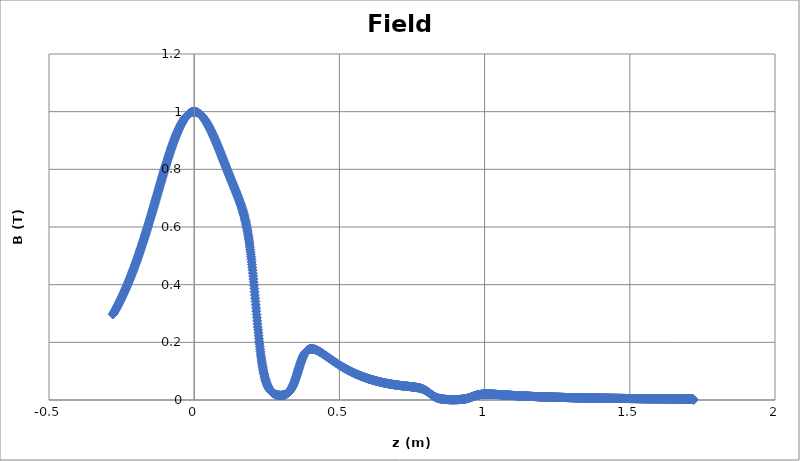
| Category | Series 0 |
|---|---|
| -0.28 | 0.297 |
| -0.279 | 0.298 |
| -0.278 | 0.3 |
| -0.277 | 0.302 |
| -0.276 | 0.304 |
| -0.275 | 0.306 |
| -0.274 | 0.307 |
| -0.273 | 0.309 |
| -0.272 | 0.311 |
| -0.271 | 0.313 |
| -0.27 | 0.315 |
| -0.269 | 0.317 |
| -0.268 | 0.319 |
| -0.267 | 0.32 |
| -0.266 | 0.322 |
| -0.265 | 0.324 |
| -0.264 | 0.326 |
| -0.263 | 0.328 |
| -0.262 | 0.33 |
| -0.261 | 0.332 |
| -0.26 | 0.334 |
| -0.259 | 0.336 |
| -0.258 | 0.338 |
| -0.257 | 0.34 |
| -0.256 | 0.342 |
| -0.255 | 0.344 |
| -0.254 | 0.346 |
| -0.253 | 0.348 |
| -0.252 | 0.351 |
| -0.251 | 0.353 |
| -0.25 | 0.355 |
| -0.249 | 0.357 |
| -0.248 | 0.359 |
| -0.247 | 0.361 |
| -0.246 | 0.363 |
| -0.245 | 0.366 |
| -0.244 | 0.368 |
| -0.243 | 0.37 |
| -0.242 | 0.372 |
| -0.241 | 0.374 |
| -0.24 | 0.377 |
| -0.239 | 0.379 |
| -0.238 | 0.381 |
| -0.237 | 0.383 |
| -0.236 | 0.386 |
| -0.235 | 0.388 |
| -0.234 | 0.39 |
| -0.233 | 0.393 |
| -0.232 | 0.395 |
| -0.231 | 0.397 |
| -0.23 | 0.4 |
| -0.229 | 0.402 |
| -0.228 | 0.405 |
| -0.227 | 0.407 |
| -0.226 | 0.41 |
| -0.225 | 0.412 |
| -0.224 | 0.414 |
| -0.223 | 0.417 |
| -0.222 | 0.419 |
| -0.221 | 0.422 |
| -0.22 | 0.424 |
| -0.219 | 0.427 |
| -0.218 | 0.43 |
| -0.217 | 0.432 |
| -0.216 | 0.435 |
| -0.215 | 0.437 |
| -0.214 | 0.44 |
| -0.213 | 0.443 |
| -0.212 | 0.445 |
| -0.211 | 0.448 |
| -0.21 | 0.45 |
| -0.209 | 0.453 |
| -0.208 | 0.456 |
| -0.207 | 0.459 |
| -0.206 | 0.461 |
| -0.205 | 0.464 |
| -0.204 | 0.467 |
| -0.203 | 0.47 |
| -0.202 | 0.472 |
| -0.201 | 0.475 |
| -0.2 | 0.478 |
| -0.199 | 0.481 |
| -0.198 | 0.484 |
| -0.197 | 0.486 |
| -0.196 | 0.489 |
| -0.195 | 0.492 |
| -0.194 | 0.495 |
| -0.193 | 0.498 |
| -0.192 | 0.501 |
| -0.191 | 0.504 |
| -0.19 | 0.507 |
| -0.189 | 0.51 |
| -0.188 | 0.513 |
| -0.187 | 0.516 |
| -0.186 | 0.519 |
| -0.185 | 0.522 |
| -0.184 | 0.525 |
| -0.183 | 0.528 |
| -0.182 | 0.531 |
| -0.181 | 0.534 |
| -0.18 | 0.537 |
| -0.179 | 0.54 |
| -0.178 | 0.543 |
| -0.177 | 0.546 |
| -0.176 | 0.549 |
| -0.175 | 0.552 |
| -0.174 | 0.556 |
| -0.173 | 0.559 |
| -0.172 | 0.562 |
| -0.171 | 0.565 |
| -0.17 | 0.568 |
| -0.169 | 0.571 |
| -0.168 | 0.575 |
| -0.167 | 0.578 |
| -0.166 | 0.581 |
| -0.165 | 0.584 |
| -0.164 | 0.588 |
| -0.163 | 0.591 |
| -0.162 | 0.594 |
| -0.161 | 0.597 |
| -0.16 | 0.601 |
| -0.159 | 0.604 |
| -0.158 | 0.607 |
| -0.157 | 0.611 |
| -0.156 | 0.614 |
| -0.155 | 0.617 |
| -0.154 | 0.621 |
| -0.153 | 0.624 |
| -0.152 | 0.627 |
| -0.151 | 0.631 |
| -0.15 | 0.634 |
| -0.149 | 0.638 |
| -0.148 | 0.641 |
| -0.147 | 0.644 |
| -0.146 | 0.648 |
| -0.145 | 0.651 |
| -0.144 | 0.655 |
| -0.143 | 0.658 |
| -0.142 | 0.662 |
| -0.141 | 0.665 |
| -0.14 | 0.668 |
| -0.139 | 0.672 |
| -0.138 | 0.675 |
| -0.137 | 0.679 |
| -0.136 | 0.682 |
| -0.135 | 0.686 |
| -0.134 | 0.689 |
| -0.133 | 0.693 |
| -0.132 | 0.696 |
| -0.131 | 0.7 |
| -0.13 | 0.703 |
| -0.129 | 0.707 |
| -0.128 | 0.71 |
| -0.127 | 0.714 |
| -0.126 | 0.717 |
| -0.125 | 0.721 |
| -0.124 | 0.724 |
| -0.123 | 0.727 |
| -0.122 | 0.731 |
| -0.121 | 0.734 |
| -0.12 | 0.738 |
| -0.119 | 0.741 |
| -0.118 | 0.745 |
| -0.117 | 0.748 |
| -0.116 | 0.752 |
| -0.115 | 0.755 |
| -0.114 | 0.759 |
| -0.113 | 0.762 |
| -0.112 | 0.766 |
| -0.111 | 0.769 |
| -0.11 | 0.772 |
| -0.109 | 0.776 |
| -0.108 | 0.779 |
| -0.107 | 0.783 |
| -0.106 | 0.786 |
| -0.105 | 0.789 |
| -0.104 | 0.793 |
| -0.103 | 0.796 |
| -0.102 | 0.799 |
| -0.101 | 0.803 |
| -0.1 | 0.806 |
| -0.099 | 0.809 |
| -0.098 | 0.813 |
| -0.097 | 0.816 |
| -0.096 | 0.819 |
| -0.095 | 0.823 |
| -0.094 | 0.826 |
| -0.093 | 0.829 |
| -0.092 | 0.832 |
| -0.091 | 0.835 |
| -0.09 | 0.839 |
| -0.089 | 0.842 |
| -0.088 | 0.845 |
| -0.087 | 0.848 |
| -0.086 | 0.851 |
| -0.085 | 0.854 |
| -0.084 | 0.857 |
| -0.083 | 0.86 |
| -0.082 | 0.863 |
| -0.081 | 0.866 |
| -0.08 | 0.869 |
| -0.079 | 0.872 |
| -0.078 | 0.875 |
| -0.077 | 0.878 |
| -0.076 | 0.881 |
| -0.075 | 0.884 |
| -0.074 | 0.887 |
| -0.073 | 0.89 |
| -0.072 | 0.892 |
| -0.071 | 0.895 |
| -0.07 | 0.898 |
| -0.069 | 0.901 |
| -0.068 | 0.903 |
| -0.067 | 0.906 |
| -0.066 | 0.909 |
| -0.065 | 0.911 |
| -0.064 | 0.914 |
| -0.063 | 0.916 |
| -0.062 | 0.919 |
| -0.061 | 0.921 |
| -0.06 | 0.924 |
| -0.059 | 0.926 |
| -0.058 | 0.929 |
| -0.057 | 0.931 |
| -0.056 | 0.933 |
| -0.055 | 0.936 |
| -0.054 | 0.938 |
| -0.053 | 0.94 |
| -0.052 | 0.942 |
| -0.051 | 0.944 |
| -0.05 | 0.946 |
| -0.049 | 0.948 |
| -0.048 | 0.951 |
| -0.047 | 0.952 |
| -0.046 | 0.954 |
| -0.045 | 0.956 |
| -0.044 | 0.958 |
| -0.043 | 0.96 |
| -0.042 | 0.962 |
| -0.041 | 0.964 |
| -0.04 | 0.965 |
| -0.039 | 0.967 |
| -0.038 | 0.969 |
| -0.037 | 0.97 |
| -0.036 | 0.972 |
| -0.035 | 0.973 |
| -0.034 | 0.975 |
| -0.033 | 0.976 |
| -0.032 | 0.978 |
| -0.031 | 0.979 |
| -0.03 | 0.98 |
| -0.029 | 0.982 |
| -0.028 | 0.983 |
| -0.027 | 0.984 |
| -0.026 | 0.985 |
| -0.025 | 0.986 |
| -0.024 | 0.988 |
| -0.023 | 0.989 |
| -0.022 | 0.99 |
| -0.021 | 0.99 |
| -0.02 | 0.991 |
| -0.019 | 0.992 |
| -0.018 | 0.993 |
| -0.017 | 0.994 |
| -0.016 | 0.994 |
| -0.015 | 0.995 |
| -0.014 | 0.996 |
| -0.013 | 0.996 |
| -0.012 | 0.997 |
| -0.011 | 0.997 |
| -0.01 | 0.998 |
| -0.009 | 0.998 |
| -0.008 | 0.999 |
| -0.007 | 0.999 |
| -0.006 | 0.999 |
| -0.005 | 0.999 |
| -0.004 | 1 |
| -0.003 | 1 |
| -0.002 | 1 |
| -0.001 | 1 |
| 0.0 | 1 |
| 0.001 | 1 |
| 0.002 | 1 |
| 0.003 | 1 |
| 0.004 | 1 |
| 0.005 | 0.999 |
| 0.006 | 0.999 |
| 0.007 | 0.999 |
| 0.008 | 0.999 |
| 0.009 | 0.998 |
| 0.01 | 0.998 |
| 0.011 | 0.997 |
| 0.012 | 0.997 |
| 0.013 | 0.996 |
| 0.014 | 0.996 |
| 0.015 | 0.995 |
| 0.016 | 0.994 |
| 0.017 | 0.994 |
| 0.018 | 0.993 |
| 0.019 | 0.992 |
| 0.02 | 0.991 |
| 0.021 | 0.99 |
| 0.022 | 0.99 |
| 0.023 | 0.989 |
| 0.024 | 0.988 |
| 0.025 | 0.987 |
| 0.026 | 0.985 |
| 0.027 | 0.984 |
| 0.028 | 0.983 |
| 0.029 | 0.982 |
| 0.03 | 0.981 |
| 0.031 | 0.98 |
| 0.032 | 0.978 |
| 0.033 | 0.977 |
| 0.034 | 0.976 |
| 0.035 | 0.974 |
| 0.036 | 0.973 |
| 0.037 | 0.971 |
| 0.038 | 0.97 |
| 0.039 | 0.968 |
| 0.04 | 0.967 |
| 0.041 | 0.965 |
| 0.042 | 0.964 |
| 0.043 | 0.962 |
| 0.044 | 0.96 |
| 0.045 | 0.958 |
| 0.046 | 0.957 |
| 0.047 | 0.955 |
| 0.048 | 0.953 |
| 0.049 | 0.951 |
| 0.05 | 0.949 |
| 0.051 | 0.948 |
| 0.052 | 0.946 |
| 0.053 | 0.944 |
| 0.054 | 0.942 |
| 0.055 | 0.94 |
| 0.056 | 0.938 |
| 0.057 | 0.936 |
| 0.058 | 0.934 |
| 0.059 | 0.932 |
| 0.06 | 0.929 |
| 0.061 | 0.927 |
| 0.062 | 0.925 |
| 0.063 | 0.923 |
| 0.064 | 0.921 |
| 0.065 | 0.919 |
| 0.066 | 0.916 |
| 0.067 | 0.914 |
| 0.068 | 0.912 |
| 0.069 | 0.909 |
| 0.07 | 0.907 |
| 0.071 | 0.905 |
| 0.072 | 0.902 |
| 0.073 | 0.9 |
| 0.074 | 0.898 |
| 0.075 | 0.895 |
| 0.076 | 0.893 |
| 0.077 | 0.891 |
| 0.078 | 0.888 |
| 0.079 | 0.886 |
| 0.08 | 0.883 |
| 0.081 | 0.881 |
| 0.082 | 0.878 |
| 0.083 | 0.876 |
| 0.084 | 0.873 |
| 0.085 | 0.871 |
| 0.086 | 0.868 |
| 0.087 | 0.866 |
| 0.088 | 0.863 |
| 0.089 | 0.861 |
| 0.09 | 0.858 |
| 0.091 | 0.856 |
| 0.092 | 0.853 |
| 0.093 | 0.851 |
| 0.094 | 0.848 |
| 0.095 | 0.845 |
| 0.096 | 0.843 |
| 0.097 | 0.84 |
| 0.098 | 0.838 |
| 0.099 | 0.835 |
| 0.1 | 0.833 |
| 0.101 | 0.83 |
| 0.102 | 0.828 |
| 0.103 | 0.825 |
| 0.104 | 0.822 |
| 0.105 | 0.82 |
| 0.106 | 0.817 |
| 0.107 | 0.815 |
| 0.108 | 0.812 |
| 0.109 | 0.81 |
| 0.11 | 0.807 |
| 0.111 | 0.804 |
| 0.112 | 0.802 |
| 0.113 | 0.799 |
| 0.114 | 0.797 |
| 0.115 | 0.794 |
| 0.116 | 0.792 |
| 0.117 | 0.789 |
| 0.118 | 0.787 |
| 0.119 | 0.784 |
| 0.12 | 0.781 |
| 0.121 | 0.779 |
| 0.122 | 0.776 |
| 0.123 | 0.774 |
| 0.124 | 0.771 |
| 0.125 | 0.769 |
| 0.126 | 0.766 |
| 0.127 | 0.764 |
| 0.128 | 0.761 |
| 0.129 | 0.759 |
| 0.13 | 0.756 |
| 0.131 | 0.754 |
| 0.132 | 0.751 |
| 0.133 | 0.749 |
| 0.134 | 0.746 |
| 0.135 | 0.744 |
| 0.136 | 0.741 |
| 0.137 | 0.739 |
| 0.138 | 0.736 |
| 0.139 | 0.734 |
| 0.14 | 0.731 |
| 0.141 | 0.729 |
| 0.142 | 0.726 |
| 0.143 | 0.724 |
| 0.144 | 0.721 |
| 0.145 | 0.719 |
| 0.146 | 0.716 |
| 0.147 | 0.714 |
| 0.148 | 0.711 |
| 0.149 | 0.709 |
| 0.15 | 0.706 |
| 0.151 | 0.703 |
| 0.152 | 0.701 |
| 0.153 | 0.698 |
| 0.154 | 0.695 |
| 0.155 | 0.693 |
| 0.156 | 0.69 |
| 0.157 | 0.687 |
| 0.158 | 0.684 |
| 0.159 | 0.682 |
| 0.16 | 0.679 |
| 0.161 | 0.676 |
| 0.162 | 0.673 |
| 0.163 | 0.67 |
| 0.164 | 0.667 |
| 0.165 | 0.664 |
| 0.166 | 0.66 |
| 0.167 | 0.657 |
| 0.168 | 0.654 |
| 0.169 | 0.65 |
| 0.17 | 0.647 |
| 0.171 | 0.643 |
| 0.172 | 0.639 |
| 0.173 | 0.635 |
| 0.174 | 0.631 |
| 0.175 | 0.627 |
| 0.176 | 0.623 |
| 0.177 | 0.619 |
| 0.178 | 0.614 |
| 0.179 | 0.609 |
| 0.18 | 0.604 |
| 0.181 | 0.599 |
| 0.182 | 0.594 |
| 0.183 | 0.589 |
| 0.184 | 0.583 |
| 0.185 | 0.577 |
| 0.186 | 0.571 |
| 0.187 | 0.565 |
| 0.188 | 0.558 |
| 0.189 | 0.552 |
| 0.19 | 0.545 |
| 0.191 | 0.537 |
| 0.192 | 0.53 |
| 0.193 | 0.522 |
| 0.194 | 0.514 |
| 0.195 | 0.506 |
| 0.196 | 0.497 |
| 0.197 | 0.488 |
| 0.198 | 0.479 |
| 0.199 | 0.47 |
| 0.2 | 0.46 |
| 0.201 | 0.45 |
| 0.202 | 0.44 |
| 0.203 | 0.43 |
| 0.204 | 0.419 |
| 0.205 | 0.408 |
| 0.206 | 0.398 |
| 0.207 | 0.387 |
| 0.208 | 0.375 |
| 0.209 | 0.364 |
| 0.21 | 0.353 |
| 0.211 | 0.342 |
| 0.212 | 0.33 |
| 0.213 | 0.319 |
| 0.214 | 0.308 |
| 0.215 | 0.297 |
| 0.216 | 0.286 |
| 0.217 | 0.275 |
| 0.218 | 0.264 |
| 0.219 | 0.253 |
| 0.22 | 0.243 |
| 0.221 | 0.233 |
| 0.222 | 0.223 |
| 0.223 | 0.213 |
| 0.224 | 0.203 |
| 0.225 | 0.194 |
| 0.226 | 0.185 |
| 0.227 | 0.177 |
| 0.228 | 0.168 |
| 0.229 | 0.16 |
| 0.23 | 0.153 |
| 0.231 | 0.145 |
| 0.232 | 0.138 |
| 0.233 | 0.131 |
| 0.234 | 0.125 |
| 0.235 | 0.119 |
| 0.236 | 0.113 |
| 0.237 | 0.107 |
| 0.238 | 0.102 |
| 0.239 | 0.097 |
| 0.24 | 0.092 |
| 0.241 | 0.088 |
| 0.242 | 0.083 |
| 0.243 | 0.079 |
| 0.244 | 0.075 |
| 0.245 | 0.072 |
| 0.246 | 0.068 |
| 0.247 | 0.065 |
| 0.248 | 0.062 |
| 0.249 | 0.059 |
| 0.25 | 0.056 |
| 0.251 | 0.054 |
| 0.252 | 0.051 |
| 0.253 | 0.049 |
| 0.254 | 0.047 |
| 0.255 | 0.045 |
| 0.256 | 0.043 |
| 0.257 | 0.041 |
| 0.258 | 0.039 |
| 0.259 | 0.038 |
| 0.26 | 0.036 |
| 0.261 | 0.035 |
| 0.262 | 0.034 |
| 0.263 | 0.032 |
| 0.264 | 0.031 |
| 0.265 | 0.03 |
| 0.266 | 0.029 |
| 0.267 | 0.028 |
| 0.268 | 0.027 |
| 0.269 | 0.026 |
| 0.27 | 0.025 |
| 0.271 | 0.025 |
| 0.272 | 0.024 |
| 0.273 | 0.023 |
| 0.274 | 0.022 |
| 0.275 | 0.022 |
| 0.276 | 0.021 |
| 0.277 | 0.021 |
| 0.278 | 0.02 |
| 0.279 | 0.02 |
| 0.28 | 0.019 |
| 0.281 | 0.019 |
| 0.282 | 0.019 |
| 0.283 | 0.018 |
| 0.284 | 0.018 |
| 0.285 | 0.018 |
| 0.286 | 0.017 |
| 0.287 | 0.017 |
| 0.288 | 0.017 |
| 0.289 | 0.017 |
| 0.29 | 0.016 |
| 0.291 | 0.016 |
| 0.292 | 0.016 |
| 0.293 | 0.016 |
| 0.294 | 0.016 |
| 0.295 | 0.016 |
| 0.296 | 0.016 |
| 0.297 | 0.016 |
| 0.298 | 0.016 |
| 0.299 | 0.016 |
| 0.3 | 0.016 |
| 0.301 | 0.016 |
| 0.302 | 0.016 |
| 0.303 | 0.016 |
| 0.304 | 0.016 |
| 0.305 | 0.016 |
| 0.306 | 0.017 |
| 0.307 | 0.017 |
| 0.308 | 0.017 |
| 0.309 | 0.017 |
| 0.31 | 0.018 |
| 0.311 | 0.018 |
| 0.312 | 0.018 |
| 0.313 | 0.019 |
| 0.314 | 0.019 |
| 0.315 | 0.02 |
| 0.316 | 0.02 |
| 0.317 | 0.021 |
| 0.318 | 0.021 |
| 0.319 | 0.022 |
| 0.32 | 0.022 |
| 0.321 | 0.023 |
| 0.322 | 0.024 |
| 0.323 | 0.025 |
| 0.324 | 0.026 |
| 0.325 | 0.027 |
| 0.326 | 0.028 |
| 0.327 | 0.029 |
| 0.328 | 0.03 |
| 0.329 | 0.031 |
| 0.33 | 0.032 |
| 0.331 | 0.034 |
| 0.332 | 0.035 |
| 0.333 | 0.037 |
| 0.334 | 0.038 |
| 0.335 | 0.04 |
| 0.336 | 0.042 |
| 0.337 | 0.044 |
| 0.338 | 0.046 |
| 0.339 | 0.048 |
| 0.34 | 0.05 |
| 0.341 | 0.052 |
| 0.342 | 0.055 |
| 0.343 | 0.057 |
| 0.344 | 0.06 |
| 0.345 | 0.062 |
| 0.346 | 0.065 |
| 0.347 | 0.068 |
| 0.348 | 0.071 |
| 0.349 | 0.074 |
| 0.35 | 0.077 |
| 0.351 | 0.08 |
| 0.352 | 0.083 |
| 0.353 | 0.086 |
| 0.354 | 0.089 |
| 0.355 | 0.092 |
| 0.356 | 0.096 |
| 0.357 | 0.099 |
| 0.358 | 0.102 |
| 0.359 | 0.106 |
| 0.36 | 0.109 |
| 0.361 | 0.112 |
| 0.362 | 0.115 |
| 0.363 | 0.118 |
| 0.364 | 0.122 |
| 0.365 | 0.125 |
| 0.366 | 0.128 |
| 0.367 | 0.131 |
| 0.368 | 0.133 |
| 0.369 | 0.136 |
| 0.37 | 0.139 |
| 0.371 | 0.142 |
| 0.372 | 0.144 |
| 0.373 | 0.146 |
| 0.374 | 0.149 |
| 0.375 | 0.151 |
| 0.376 | 0.153 |
| 0.377 | 0.155 |
| 0.378 | 0.157 |
| 0.379 | 0.159 |
| 0.38 | 0.161 |
| 0.381 | 0.162 |
| 0.382 | 0.164 |
| 0.383 | 0.165 |
| 0.384 | 0.166 |
| 0.385 | 0.168 |
| 0.386 | 0.169 |
| 0.387 | 0.17 |
| 0.388 | 0.171 |
| 0.389 | 0.172 |
| 0.39 | 0.173 |
| 0.391 | 0.173 |
| 0.392 | 0.174 |
| 0.393 | 0.175 |
| 0.394 | 0.175 |
| 0.395 | 0.176 |
| 0.396 | 0.176 |
| 0.397 | 0.176 |
| 0.398 | 0.177 |
| 0.399 | 0.177 |
| 0.4 | 0.177 |
| 0.401 | 0.177 |
| 0.402 | 0.177 |
| 0.403 | 0.178 |
| 0.404 | 0.178 |
| 0.405 | 0.178 |
| 0.406 | 0.177 |
| 0.407 | 0.177 |
| 0.408 | 0.177 |
| 0.409 | 0.177 |
| 0.41 | 0.177 |
| 0.411 | 0.177 |
| 0.412 | 0.176 |
| 0.413 | 0.176 |
| 0.414 | 0.176 |
| 0.415 | 0.176 |
| 0.416 | 0.175 |
| 0.417 | 0.175 |
| 0.418 | 0.174 |
| 0.419 | 0.174 |
| 0.42 | 0.174 |
| 0.421 | 0.173 |
| 0.422 | 0.173 |
| 0.423 | 0.172 |
| 0.424 | 0.172 |
| 0.425 | 0.171 |
| 0.426 | 0.171 |
| 0.427 | 0.17 |
| 0.428 | 0.17 |
| 0.429 | 0.169 |
| 0.43 | 0.168 |
| 0.431 | 0.168 |
| 0.432 | 0.167 |
| 0.433 | 0.167 |
| 0.434 | 0.166 |
| 0.435 | 0.165 |
| 0.436 | 0.165 |
| 0.437 | 0.164 |
| 0.438 | 0.164 |
| 0.439 | 0.163 |
| 0.44 | 0.162 |
| 0.441 | 0.162 |
| 0.442 | 0.161 |
| 0.443 | 0.16 |
| 0.444 | 0.16 |
| 0.445 | 0.159 |
| 0.446 | 0.158 |
| 0.447 | 0.158 |
| 0.448 | 0.157 |
| 0.449 | 0.156 |
| 0.45 | 0.155 |
| 0.451 | 0.155 |
| 0.452 | 0.154 |
| 0.453 | 0.153 |
| 0.454 | 0.153 |
| 0.455 | 0.152 |
| 0.456 | 0.151 |
| 0.457 | 0.151 |
| 0.458 | 0.15 |
| 0.459 | 0.149 |
| 0.46 | 0.148 |
| 0.461 | 0.148 |
| 0.462 | 0.147 |
| 0.463 | 0.146 |
| 0.464 | 0.146 |
| 0.465 | 0.145 |
| 0.466 | 0.144 |
| 0.467 | 0.143 |
| 0.468 | 0.143 |
| 0.469 | 0.142 |
| 0.47 | 0.141 |
| 0.471 | 0.141 |
| 0.472 | 0.14 |
| 0.473 | 0.139 |
| 0.474 | 0.138 |
| 0.475 | 0.138 |
| 0.476 | 0.137 |
| 0.477 | 0.136 |
| 0.478 | 0.136 |
| 0.479 | 0.135 |
| 0.48 | 0.134 |
| 0.481 | 0.134 |
| 0.482 | 0.133 |
| 0.483 | 0.132 |
| 0.484 | 0.132 |
| 0.485 | 0.131 |
| 0.486 | 0.13 |
| 0.487 | 0.13 |
| 0.488 | 0.129 |
| 0.489 | 0.128 |
| 0.49 | 0.128 |
| 0.491 | 0.127 |
| 0.492 | 0.126 |
| 0.493 | 0.126 |
| 0.494 | 0.125 |
| 0.495 | 0.124 |
| 0.496 | 0.124 |
| 0.497 | 0.123 |
| 0.498 | 0.122 |
| 0.499 | 0.122 |
| 0.5 | 0.121 |
| 0.501 | 0.12 |
| 0.502 | 0.12 |
| 0.503 | 0.119 |
| 0.504 | 0.119 |
| 0.505 | 0.118 |
| 0.506 | 0.117 |
| 0.507 | 0.117 |
| 0.508 | 0.116 |
| 0.509 | 0.116 |
| 0.51 | 0.115 |
| 0.511 | 0.114 |
| 0.512 | 0.114 |
| 0.513 | 0.113 |
| 0.514 | 0.113 |
| 0.515 | 0.112 |
| 0.516 | 0.111 |
| 0.517 | 0.111 |
| 0.518 | 0.11 |
| 0.519 | 0.11 |
| 0.52 | 0.109 |
| 0.521 | 0.108 |
| 0.522 | 0.108 |
| 0.523 | 0.107 |
| 0.524 | 0.107 |
| 0.525 | 0.106 |
| 0.526 | 0.106 |
| 0.527 | 0.105 |
| 0.528 | 0.105 |
| 0.529 | 0.104 |
| 0.53 | 0.104 |
| 0.531 | 0.103 |
| 0.532 | 0.103 |
| 0.533 | 0.102 |
| 0.534 | 0.101 |
| 0.535 | 0.101 |
| 0.536 | 0.1 |
| 0.537 | 0.1 |
| 0.538 | 0.099 |
| 0.539 | 0.099 |
| 0.54 | 0.098 |
| 0.541 | 0.098 |
| 0.542 | 0.097 |
| 0.543 | 0.097 |
| 0.544 | 0.096 |
| 0.545 | 0.096 |
| 0.546 | 0.095 |
| 0.547 | 0.095 |
| 0.548 | 0.095 |
| 0.549 | 0.094 |
| 0.55 | 0.094 |
| 0.551 | 0.093 |
| 0.552 | 0.093 |
| 0.553 | 0.092 |
| 0.554 | 0.092 |
| 0.555 | 0.091 |
| 0.556 | 0.091 |
| 0.557 | 0.09 |
| 0.558 | 0.09 |
| 0.559 | 0.09 |
| 0.56 | 0.089 |
| 0.561 | 0.089 |
| 0.562 | 0.088 |
| 0.563 | 0.088 |
| 0.564 | 0.087 |
| 0.565 | 0.087 |
| 0.566 | 0.087 |
| 0.567 | 0.086 |
| 0.568 | 0.086 |
| 0.569 | 0.085 |
| 0.57 | 0.085 |
| 0.571 | 0.084 |
| 0.572 | 0.084 |
| 0.573 | 0.084 |
| 0.574 | 0.083 |
| 0.575 | 0.083 |
| 0.576 | 0.082 |
| 0.577 | 0.082 |
| 0.578 | 0.082 |
| 0.579 | 0.081 |
| 0.58 | 0.081 |
| 0.581 | 0.081 |
| 0.582 | 0.08 |
| 0.583 | 0.08 |
| 0.584 | 0.079 |
| 0.585 | 0.079 |
| 0.586 | 0.079 |
| 0.587 | 0.078 |
| 0.588 | 0.078 |
| 0.589 | 0.078 |
| 0.59 | 0.077 |
| 0.591 | 0.077 |
| 0.592 | 0.077 |
| 0.593 | 0.076 |
| 0.594 | 0.076 |
| 0.595 | 0.076 |
| 0.596 | 0.075 |
| 0.597 | 0.075 |
| 0.598 | 0.075 |
| 0.599 | 0.074 |
| 0.6 | 0.074 |
| 0.601 | 0.074 |
| 0.602 | 0.073 |
| 0.603 | 0.073 |
| 0.604 | 0.073 |
| 0.605 | 0.072 |
| 0.606 | 0.072 |
| 0.607 | 0.072 |
| 0.608 | 0.071 |
| 0.609 | 0.071 |
| 0.61 | 0.071 |
| 0.611 | 0.07 |
| 0.612 | 0.07 |
| 0.613 | 0.07 |
| 0.614 | 0.07 |
| 0.615 | 0.069 |
| 0.616 | 0.069 |
| 0.617 | 0.069 |
| 0.618 | 0.068 |
| 0.619 | 0.068 |
| 0.62 | 0.068 |
| 0.621 | 0.068 |
| 0.622 | 0.067 |
| 0.623 | 0.067 |
| 0.624 | 0.067 |
| 0.625 | 0.066 |
| 0.626 | 0.066 |
| 0.627 | 0.066 |
| 0.628 | 0.066 |
| 0.629 | 0.065 |
| 0.63 | 0.065 |
| 0.631 | 0.065 |
| 0.632 | 0.065 |
| 0.633 | 0.064 |
| 0.634 | 0.064 |
| 0.635 | 0.064 |
| 0.636 | 0.064 |
| 0.637 | 0.063 |
| 0.638 | 0.063 |
| 0.639 | 0.063 |
| 0.64 | 0.063 |
| 0.641 | 0.062 |
| 0.642 | 0.062 |
| 0.643 | 0.062 |
| 0.644 | 0.062 |
| 0.645 | 0.061 |
| 0.646 | 0.061 |
| 0.647 | 0.061 |
| 0.648 | 0.061 |
| 0.649 | 0.061 |
| 0.65 | 0.06 |
| 0.651 | 0.06 |
| 0.652 | 0.06 |
| 0.653 | 0.06 |
| 0.654 | 0.059 |
| 0.655 | 0.059 |
| 0.656 | 0.059 |
| 0.657 | 0.059 |
| 0.658 | 0.059 |
| 0.659 | 0.058 |
| 0.66 | 0.058 |
| 0.661 | 0.058 |
| 0.662 | 0.058 |
| 0.663 | 0.058 |
| 0.664 | 0.057 |
| 0.665 | 0.057 |
| 0.666 | 0.057 |
| 0.667 | 0.057 |
| 0.668 | 0.057 |
| 0.669 | 0.056 |
| 0.67 | 0.056 |
| 0.671 | 0.056 |
| 0.672 | 0.056 |
| 0.673 | 0.056 |
| 0.674 | 0.056 |
| 0.675 | 0.055 |
| 0.676 | 0.055 |
| 0.677 | 0.055 |
| 0.678 | 0.055 |
| 0.679 | 0.055 |
| 0.68 | 0.055 |
| 0.681 | 0.054 |
| 0.682 | 0.054 |
| 0.683 | 0.054 |
| 0.684 | 0.054 |
| 0.685 | 0.054 |
| 0.686 | 0.054 |
| 0.687 | 0.053 |
| 0.688 | 0.053 |
| 0.689 | 0.053 |
| 0.69 | 0.053 |
| 0.691 | 0.053 |
| 0.692 | 0.053 |
| 0.693 | 0.053 |
| 0.694 | 0.052 |
| 0.695 | 0.052 |
| 0.696 | 0.052 |
| 0.697 | 0.052 |
| 0.698 | 0.052 |
| 0.699 | 0.052 |
| 0.7 | 0.052 |
| 0.701 | 0.051 |
| 0.702 | 0.051 |
| 0.703 | 0.051 |
| 0.704 | 0.051 |
| 0.705 | 0.051 |
| 0.706 | 0.051 |
| 0.707 | 0.051 |
| 0.708 | 0.05 |
| 0.709 | 0.05 |
| 0.71 | 0.05 |
| 0.711 | 0.05 |
| 0.712 | 0.05 |
| 0.713 | 0.05 |
| 0.714 | 0.05 |
| 0.715 | 0.05 |
| 0.716 | 0.05 |
| 0.717 | 0.049 |
| 0.718 | 0.049 |
| 0.719 | 0.049 |
| 0.72 | 0.049 |
| 0.721 | 0.049 |
| 0.722 | 0.049 |
| 0.723 | 0.049 |
| 0.724 | 0.049 |
| 0.725 | 0.048 |
| 0.726 | 0.048 |
| 0.727 | 0.048 |
| 0.728 | 0.048 |
| 0.729 | 0.048 |
| 0.73 | 0.048 |
| 0.731 | 0.048 |
| 0.732 | 0.048 |
| 0.733 | 0.048 |
| 0.734 | 0.048 |
| 0.735 | 0.047 |
| 0.736 | 0.047 |
| 0.737 | 0.047 |
| 0.738 | 0.047 |
| 0.739 | 0.047 |
| 0.74 | 0.047 |
| 0.741 | 0.047 |
| 0.742 | 0.047 |
| 0.743 | 0.047 |
| 0.744 | 0.046 |
| 0.745 | 0.046 |
| 0.746 | 0.046 |
| 0.747 | 0.046 |
| 0.748 | 0.046 |
| 0.749 | 0.046 |
| 0.75 | 0.046 |
| 0.751 | 0.046 |
| 0.752 | 0.046 |
| 0.753 | 0.045 |
| 0.754 | 0.045 |
| 0.755 | 0.045 |
| 0.756 | 0.045 |
| 0.757 | 0.045 |
| 0.758 | 0.045 |
| 0.759 | 0.045 |
| 0.76 | 0.045 |
| 0.761 | 0.044 |
| 0.762 | 0.044 |
| 0.763 | 0.044 |
| 0.764 | 0.044 |
| 0.765 | 0.044 |
| 0.766 | 0.044 |
| 0.767 | 0.043 |
| 0.768 | 0.043 |
| 0.769 | 0.043 |
| 0.77 | 0.043 |
| 0.771 | 0.043 |
| 0.772 | 0.042 |
| 0.773 | 0.042 |
| 0.774 | 0.042 |
| 0.775 | 0.042 |
| 0.776 | 0.042 |
| 0.777 | 0.041 |
| 0.778 | 0.041 |
| 0.779 | 0.041 |
| 0.78 | 0.04 |
| 0.781 | 0.04 |
| 0.782 | 0.04 |
| 0.783 | 0.039 |
| 0.784 | 0.039 |
| 0.785 | 0.039 |
| 0.786 | 0.038 |
| 0.787 | 0.038 |
| 0.788 | 0.038 |
| 0.789 | 0.037 |
| 0.79 | 0.037 |
| 0.791 | 0.036 |
| 0.792 | 0.036 |
| 0.793 | 0.035 |
| 0.794 | 0.035 |
| 0.795 | 0.034 |
| 0.796 | 0.034 |
| 0.797 | 0.033 |
| 0.798 | 0.032 |
| 0.799 | 0.032 |
| 0.8 | 0.031 |
| 0.801 | 0.03 |
| 0.802 | 0.03 |
| 0.803 | 0.029 |
| 0.804 | 0.028 |
| 0.805 | 0.028 |
| 0.806 | 0.027 |
| 0.807 | 0.026 |
| 0.808 | 0.025 |
| 0.809 | 0.025 |
| 0.81 | 0.024 |
| 0.811 | 0.023 |
| 0.812 | 0.022 |
| 0.813 | 0.022 |
| 0.814 | 0.021 |
| 0.815 | 0.02 |
| 0.816 | 0.019 |
| 0.817 | 0.019 |
| 0.818 | 0.018 |
| 0.819 | 0.017 |
| 0.82 | 0.016 |
| 0.821 | 0.016 |
| 0.822 | 0.015 |
| 0.823 | 0.014 |
| 0.824 | 0.014 |
| 0.825 | 0.013 |
| 0.826 | 0.013 |
| 0.827 | 0.012 |
| 0.828 | 0.011 |
| 0.829 | 0.011 |
| 0.83 | 0.01 |
| 0.831 | 0.01 |
| 0.832 | 0.009 |
| 0.833 | 0.009 |
| 0.834 | 0.008 |
| 0.835 | 0.008 |
| 0.836 | 0.008 |
| 0.837 | 0.007 |
| 0.838 | 0.007 |
| 0.839 | 0.007 |
| 0.84 | 0.006 |
| 0.841 | 0.006 |
| 0.842 | 0.006 |
| 0.843 | 0.005 |
| 0.844 | 0.005 |
| 0.845 | 0.005 |
| 0.846 | 0.005 |
| 0.847 | 0.004 |
| 0.848 | 0.004 |
| 0.849 | 0.004 |
| 0.85 | 0.004 |
| 0.851 | 0.004 |
| 0.852 | 0.003 |
| 0.853 | 0.003 |
| 0.854 | 0.003 |
| 0.855 | 0.003 |
| 0.856 | 0.003 |
| 0.857 | 0.003 |
| 0.858 | 0.003 |
| 0.859 | 0.003 |
| 0.86 | 0.002 |
| 0.861 | 0.002 |
| 0.862 | 0.002 |
| 0.863 | 0.002 |
| 0.864 | 0.002 |
| 0.865 | 0.002 |
| 0.866 | 0.002 |
| 0.867 | 0.002 |
| 0.868 | 0.002 |
| 0.869 | 0.002 |
| 0.87 | 0.002 |
| 0.871 | 0.002 |
| 0.872 | 0.002 |
| 0.873 | 0.002 |
| 0.874 | 0.002 |
| 0.875 | 0.001 |
| 0.876 | 0.001 |
| 0.877 | 0.001 |
| 0.878 | 0.001 |
| 0.879 | 0.001 |
| 0.88 | 0.001 |
| 0.881 | 0.001 |
| 0.882 | 0.001 |
| 0.883 | 0.001 |
| 0.884 | 0.001 |
| 0.885 | 0.001 |
| 0.886 | 0.001 |
| 0.887 | 0.001 |
| 0.888 | 0.001 |
| 0.889 | 0.001 |
| 0.89 | 0.001 |
| 0.891 | 0.001 |
| 0.892 | 0.001 |
| 0.893 | 0.001 |
| 0.894 | 0.001 |
| 0.895 | 0.001 |
| 0.896 | 0.001 |
| 0.897 | 0.001 |
| 0.898 | 0.001 |
| 0.899 | 0.001 |
| 0.9 | 0.001 |
| 0.901 | 0.001 |
| 0.902 | 0.001 |
| 0.903 | 0.001 |
| 0.904 | 0.001 |
| 0.905 | 0.001 |
| 0.906 | 0.001 |
| 0.907 | 0.001 |
| 0.908 | 0.001 |
| 0.909 | 0.001 |
| 0.91 | 0.002 |
| 0.911 | 0.002 |
| 0.912 | 0.002 |
| 0.913 | 0.002 |
| 0.914 | 0.002 |
| 0.915 | 0.002 |
| 0.916 | 0.002 |
| 0.917 | 0.002 |
| 0.918 | 0.002 |
| 0.919 | 0.002 |
| 0.92 | 0.002 |
| 0.921 | 0.002 |
| 0.922 | 0.002 |
| 0.923 | 0.002 |
| 0.924 | 0.003 |
| 0.925 | 0.003 |
| 0.926 | 0.003 |
| 0.927 | 0.003 |
| 0.928 | 0.003 |
| 0.929 | 0.003 |
| 0.93 | 0.003 |
| 0.931 | 0.004 |
| 0.932 | 0.004 |
| 0.933 | 0.004 |
| 0.934 | 0.004 |
| 0.935 | 0.004 |
| 0.936 | 0.004 |
| 0.937 | 0.005 |
| 0.938 | 0.005 |
| 0.939 | 0.005 |
| 0.94 | 0.005 |
| 0.941 | 0.006 |
| 0.942 | 0.006 |
| 0.943 | 0.006 |
| 0.944 | 0.007 |
| 0.945 | 0.007 |
| 0.946 | 0.007 |
| 0.947 | 0.007 |
| 0.948 | 0.008 |
| 0.949 | 0.008 |
| 0.95 | 0.009 |
| 0.951 | 0.009 |
| 0.952 | 0.009 |
| 0.953 | 0.01 |
| 0.954 | 0.01 |
| 0.955 | 0.01 |
| 0.956 | 0.011 |
| 0.957 | 0.011 |
| 0.958 | 0.011 |
| 0.959 | 0.012 |
| 0.96 | 0.012 |
| 0.961 | 0.013 |
| 0.962 | 0.013 |
| 0.963 | 0.013 |
| 0.964 | 0.014 |
| 0.965 | 0.014 |
| 0.966 | 0.014 |
| 0.967 | 0.015 |
| 0.968 | 0.015 |
| 0.969 | 0.015 |
| 0.97 | 0.016 |
| 0.971 | 0.016 |
| 0.972 | 0.016 |
| 0.973 | 0.017 |
| 0.974 | 0.017 |
| 0.975 | 0.017 |
| 0.976 | 0.017 |
| 0.977 | 0.018 |
| 0.978 | 0.018 |
| 0.979 | 0.018 |
| 0.98 | 0.018 |
| 0.981 | 0.018 |
| 0.982 | 0.019 |
| 0.983 | 0.019 |
| 0.984 | 0.019 |
| 0.985 | 0.019 |
| 0.986 | 0.019 |
| 0.987 | 0.019 |
| 0.988 | 0.02 |
| 0.989 | 0.02 |
| 0.99 | 0.02 |
| 0.991 | 0.02 |
| 0.992 | 0.02 |
| 0.993 | 0.02 |
| 0.994 | 0.02 |
| 0.995 | 0.02 |
| 0.996 | 0.02 |
| 0.997 | 0.02 |
| 0.998 | 0.02 |
| 0.999 | 0.02 |
| 1.0 | 0.02 |
| 1.001 | 0.02 |
| 1.002 | 0.02 |
| 1.003 | 0.02 |
| 1.004 | 0.02 |
| 1.005 | 0.02 |
| 1.006 | 0.02 |
| 1.007 | 0.021 |
| 1.008 | 0.021 |
| 1.009 | 0.021 |
| 1.01 | 0.02 |
| 1.011 | 0.02 |
| 1.012 | 0.02 |
| 1.013 | 0.02 |
| 1.014 | 0.02 |
| 1.015 | 0.02 |
| 1.016 | 0.02 |
| 1.017 | 0.02 |
| 1.018 | 0.02 |
| 1.019 | 0.02 |
| 1.02 | 0.02 |
| 1.021 | 0.02 |
| 1.022 | 0.02 |
| 1.023 | 0.02 |
| 1.024 | 0.02 |
| 1.025 | 0.02 |
| 1.026 | 0.02 |
| 1.027 | 0.02 |
| 1.028 | 0.02 |
| 1.029 | 0.02 |
| 1.03 | 0.02 |
| 1.031 | 0.02 |
| 1.032 | 0.02 |
| 1.033 | 0.02 |
| 1.034 | 0.02 |
| 1.035 | 0.02 |
| 1.036 | 0.02 |
| 1.037 | 0.019 |
| 1.038 | 0.019 |
| 1.039 | 0.019 |
| 1.04 | 0.019 |
| 1.041 | 0.019 |
| 1.042 | 0.019 |
| 1.043 | 0.019 |
| 1.044 | 0.019 |
| 1.045 | 0.019 |
| 1.046 | 0.019 |
| 1.047 | 0.019 |
| 1.048 | 0.019 |
| 1.049 | 0.019 |
| 1.05 | 0.019 |
| 1.051 | 0.019 |
| 1.052 | 0.019 |
| 1.053 | 0.019 |
| 1.054 | 0.018 |
| 1.055 | 0.018 |
| 1.056 | 0.018 |
| 1.057 | 0.018 |
| 1.058 | 0.018 |
| 1.059 | 0.018 |
| 1.06 | 0.018 |
| 1.061 | 0.018 |
| 1.062 | 0.018 |
| 1.063 | 0.018 |
| 1.064 | 0.018 |
| 1.065 | 0.018 |
| 1.066 | 0.018 |
| 1.067 | 0.018 |
| 1.068 | 0.018 |
| 1.069 | 0.018 |
| 1.07 | 0.017 |
| 1.071 | 0.017 |
| 1.072 | 0.017 |
| 1.073 | 0.017 |
| 1.074 | 0.017 |
| 1.075 | 0.017 |
| 1.076 | 0.017 |
| 1.077 | 0.017 |
| 1.078 | 0.017 |
| 1.079 | 0.017 |
| 1.08 | 0.017 |
| 1.081 | 0.017 |
| 1.082 | 0.017 |
| 1.083 | 0.017 |
| 1.084 | 0.017 |
| 1.085 | 0.017 |
| 1.086 | 0.016 |
| 1.087 | 0.016 |
| 1.088 | 0.016 |
| 1.089 | 0.016 |
| 1.09 | 0.016 |
| 1.091 | 0.016 |
| 1.092 | 0.016 |
| 1.093 | 0.016 |
| 1.094 | 0.016 |
| 1.095 | 0.016 |
| 1.096 | 0.016 |
| 1.097 | 0.016 |
| 1.098 | 0.016 |
| 1.099 | 0.016 |
| 1.1 | 0.016 |
| 1.101 | 0.016 |
| 1.102 | 0.015 |
| 1.103 | 0.015 |
| 1.104 | 0.015 |
| 1.105 | 0.015 |
| 1.106 | 0.015 |
| 1.107 | 0.015 |
| 1.108 | 0.015 |
| 1.109 | 0.015 |
| 1.11 | 0.015 |
| 1.111 | 0.015 |
| 1.112 | 0.015 |
| 1.113 | 0.015 |
| 1.114 | 0.015 |
| 1.115 | 0.015 |
| 1.116 | 0.015 |
| 1.117 | 0.015 |
| 1.118 | 0.015 |
| 1.119 | 0.015 |
| 1.12 | 0.014 |
| 1.121 | 0.014 |
| 1.122 | 0.014 |
| 1.123 | 0.014 |
| 1.124 | 0.014 |
| 1.125 | 0.014 |
| 1.126 | 0.014 |
| 1.127 | 0.014 |
| 1.128 | 0.014 |
| 1.129 | 0.014 |
| 1.13 | 0.014 |
| 1.131 | 0.014 |
| 1.132 | 0.014 |
| 1.133 | 0.014 |
| 1.134 | 0.014 |
| 1.135 | 0.014 |
| 1.136 | 0.014 |
| 1.137 | 0.014 |
| 1.138 | 0.014 |
| 1.139 | 0.014 |
| 1.14 | 0.013 |
| 1.141 | 0.013 |
| 1.142 | 0.013 |
| 1.143 | 0.013 |
| 1.144 | 0.013 |
| 1.145 | 0.013 |
| 1.146 | 0.013 |
| 1.147 | 0.013 |
| 1.148 | 0.013 |
| 1.149 | 0.013 |
| 1.15 | 0.013 |
| 1.151 | 0.013 |
| 1.152 | 0.013 |
| 1.153 | 0.013 |
| 1.154 | 0.013 |
| 1.155 | 0.013 |
| 1.156 | 0.013 |
| 1.157 | 0.013 |
| 1.158 | 0.013 |
| 1.159 | 0.013 |
| 1.16 | 0.013 |
| 1.161 | 0.012 |
| 1.162 | 0.012 |
| 1.163 | 0.012 |
| 1.164 | 0.012 |
| 1.165 | 0.012 |
| 1.166 | 0.012 |
| 1.167 | 0.012 |
| 1.168 | 0.012 |
| 1.169 | 0.012 |
| 1.17 | 0.012 |
| 1.171 | 0.012 |
| 1.172 | 0.012 |
| 1.173 | 0.012 |
| 1.174 | 0.012 |
| 1.175 | 0.012 |
| 1.176 | 0.012 |
| 1.177 | 0.012 |
| 1.178 | 0.012 |
| 1.179 | 0.012 |
| 1.18 | 0.012 |
| 1.181 | 0.012 |
| 1.182 | 0.012 |
| 1.183 | 0.012 |
| 1.184 | 0.012 |
| 1.185 | 0.012 |
| 1.186 | 0.011 |
| 1.187 | 0.011 |
| 1.188 | 0.011 |
| 1.189 | 0.011 |
| 1.19 | 0.011 |
| 1.191 | 0.011 |
| 1.192 | 0.011 |
| 1.193 | 0.011 |
| 1.194 | 0.011 |
| 1.195 | 0.011 |
| 1.196 | 0.011 |
| 1.197 | 0.011 |
| 1.198 | 0.011 |
| 1.199 | 0.011 |
| 1.2 | 0.011 |
| 1.201 | 0.011 |
| 1.202 | 0.011 |
| 1.203 | 0.011 |
| 1.204 | 0.011 |
| 1.205 | 0.011 |
| 1.206 | 0.011 |
| 1.207 | 0.011 |
| 1.208 | 0.011 |
| 1.209 | 0.011 |
| 1.21 | 0.011 |
| 1.211 | 0.011 |
| 1.212 | 0.011 |
| 1.213 | 0.011 |
| 1.214 | 0.01 |
| 1.215 | 0.01 |
| 1.216 | 0.01 |
| 1.217 | 0.01 |
| 1.218 | 0.01 |
| 1.219 | 0.01 |
| 1.22 | 0.01 |
| 1.221 | 0.01 |
| 1.222 | 0.01 |
| 1.223 | 0.01 |
| 1.224 | 0.01 |
| 1.225 | 0.01 |
| 1.226 | 0.01 |
| 1.227 | 0.01 |
| 1.228 | 0.01 |
| 1.229 | 0.01 |
| 1.23 | 0.01 |
| 1.231 | 0.01 |
| 1.232 | 0.01 |
| 1.233 | 0.01 |
| 1.234 | 0.01 |
| 1.235 | 0.01 |
| 1.236 | 0.01 |
| 1.237 | 0.01 |
| 1.238 | 0.01 |
| 1.239 | 0.01 |
| 1.24 | 0.01 |
| 1.241 | 0.01 |
| 1.242 | 0.01 |
| 1.243 | 0.01 |
| 1.244 | 0.01 |
| 1.245 | 0.01 |
| 1.246 | 0.01 |
| 1.247 | 0.009 |
| 1.248 | 0.009 |
| 1.249 | 0.009 |
| 1.25 | 0.009 |
| 1.251 | 0.009 |
| 1.252 | 0.009 |
| 1.253 | 0.009 |
| 1.254 | 0.009 |
| 1.255 | 0.009 |
| 1.256 | 0.009 |
| 1.257 | 0.009 |
| 1.258 | 0.009 |
| 1.259 | 0.009 |
| 1.26 | 0.009 |
| 1.261 | 0.009 |
| 1.262 | 0.009 |
| 1.263 | 0.009 |
| 1.264 | 0.009 |
| 1.265 | 0.009 |
| 1.266 | 0.009 |
| 1.267 | 0.009 |
| 1.268 | 0.009 |
| 1.269 | 0.009 |
| 1.27 | 0.009 |
| 1.271 | 0.009 |
| 1.272 | 0.009 |
| 1.273 | 0.009 |
| 1.274 | 0.009 |
| 1.275 | 0.009 |
| 1.276 | 0.009 |
| 1.277 | 0.009 |
| 1.278 | 0.009 |
| 1.279 | 0.009 |
| 1.28 | 0.009 |
| 1.281 | 0.009 |
| 1.282 | 0.009 |
| 1.283 | 0.009 |
| 1.284 | 0.009 |
| 1.285 | 0.009 |
| 1.286 | 0.008 |
| 1.287 | 0.008 |
| 1.288 | 0.008 |
| 1.289 | 0.008 |
| 1.29 | 0.008 |
| 1.291 | 0.008 |
| 1.292 | 0.008 |
| 1.293 | 0.008 |
| 1.294 | 0.008 |
| 1.295 | 0.008 |
| 1.296 | 0.008 |
| 1.297 | 0.008 |
| 1.298 | 0.008 |
| 1.299 | 0.008 |
| 1.3 | 0.008 |
| 1.301 | 0.008 |
| 1.302 | 0.008 |
| 1.303 | 0.008 |
| 1.304 | 0.008 |
| 1.305 | 0.008 |
| 1.306 | 0.008 |
| 1.307 | 0.008 |
| 1.308 | 0.008 |
| 1.309 | 0.008 |
| 1.31 | 0.008 |
| 1.311 | 0.008 |
| 1.312 | 0.008 |
| 1.313 | 0.008 |
| 1.314 | 0.008 |
| 1.315 | 0.008 |
| 1.316 | 0.008 |
| 1.317 | 0.008 |
| 1.318 | 0.008 |
| 1.319 | 0.008 |
| 1.32 | 0.008 |
| 1.321 | 0.008 |
| 1.322 | 0.008 |
| 1.323 | 0.008 |
| 1.324 | 0.008 |
| 1.325 | 0.008 |
| 1.326 | 0.008 |
| 1.327 | 0.008 |
| 1.328 | 0.008 |
| 1.329 | 0.008 |
| 1.33 | 0.008 |
| 1.331 | 0.008 |
| 1.332 | 0.008 |
| 1.333 | 0.008 |
| 1.334 | 0.007 |
| 1.335 | 0.007 |
| 1.336 | 0.007 |
| 1.337 | 0.007 |
| 1.338 | 0.007 |
| 1.339 | 0.007 |
| 1.34 | 0.007 |
| 1.341 | 0.007 |
| 1.342 | 0.007 |
| 1.343 | 0.007 |
| 1.344 | 0.007 |
| 1.345 | 0.007 |
| 1.346 | 0.007 |
| 1.347 | 0.007 |
| 1.348 | 0.007 |
| 1.349 | 0.007 |
| 1.35 | 0.007 |
| 1.351 | 0.007 |
| 1.352 | 0.007 |
| 1.353 | 0.007 |
| 1.354 | 0.007 |
| 1.355 | 0.007 |
| 1.356 | 0.007 |
| 1.357 | 0.007 |
| 1.358 | 0.007 |
| 1.359 | 0.007 |
| 1.36 | 0.007 |
| 1.361 | 0.007 |
| 1.362 | 0.007 |
| 1.363 | 0.007 |
| 1.364 | 0.007 |
| 1.365 | 0.007 |
| 1.366 | 0.007 |
| 1.367 | 0.007 |
| 1.368 | 0.007 |
| 1.369 | 0.007 |
| 1.37 | 0.007 |
| 1.371 | 0.007 |
| 1.372 | 0.007 |
| 1.373 | 0.007 |
| 1.374 | 0.007 |
| 1.375 | 0.007 |
| 1.376 | 0.007 |
| 1.377 | 0.007 |
| 1.378 | 0.007 |
| 1.379 | 0.007 |
| 1.38 | 0.007 |
| 1.381 | 0.007 |
| 1.382 | 0.007 |
| 1.383 | 0.007 |
| 1.384 | 0.007 |
| 1.385 | 0.007 |
| 1.386 | 0.007 |
| 1.387 | 0.007 |
| 1.388 | 0.007 |
| 1.389 | 0.007 |
| 1.39 | 0.007 |
| 1.391 | 0.007 |
| 1.392 | 0.006 |
| 1.393 | 0.006 |
| 1.394 | 0.006 |
| 1.395 | 0.006 |
| 1.396 | 0.006 |
| 1.397 | 0.006 |
| 1.398 | 0.006 |
| 1.399 | 0.006 |
| 1.4 | 0.006 |
| 1.401 | 0.006 |
| 1.402 | 0.006 |
| 1.403 | 0.006 |
| 1.404 | 0.006 |
| 1.405 | 0.006 |
| 1.406 | 0.006 |
| 1.407 | 0.006 |
| 1.408 | 0.006 |
| 1.409 | 0.006 |
| 1.41 | 0.006 |
| 1.411 | 0.006 |
| 1.412 | 0.006 |
| 1.413 | 0.006 |
| 1.414 | 0.006 |
| 1.415 | 0.006 |
| 1.416 | 0.006 |
| 1.417 | 0.006 |
| 1.418 | 0.006 |
| 1.419 | 0.006 |
| 1.42 | 0.006 |
| 1.421 | 0.006 |
| 1.422 | 0.006 |
| 1.423 | 0.006 |
| 1.424 | 0.006 |
| 1.425 | 0.006 |
| 1.426 | 0.006 |
| 1.427 | 0.006 |
| 1.428 | 0.006 |
| 1.429 | 0.006 |
| 1.43 | 0.006 |
| 1.431 | 0.006 |
| 1.432 | 0.006 |
| 1.433 | 0.006 |
| 1.434 | 0.006 |
| 1.435 | 0.006 |
| 1.436 | 0.006 |
| 1.437 | 0.006 |
| 1.438 | 0.006 |
| 1.439 | 0.006 |
| 1.44 | 0.006 |
| 1.441 | 0.006 |
| 1.442 | 0.006 |
| 1.443 | 0.006 |
| 1.444 | 0.006 |
| 1.445 | 0.006 |
| 1.446 | 0.006 |
| 1.447 | 0.006 |
| 1.448 | 0.006 |
| 1.449 | 0.006 |
| 1.45 | 0.006 |
| 1.451 | 0.006 |
| 1.452 | 0.006 |
| 1.453 | 0.006 |
| 1.454 | 0.006 |
| 1.455 | 0.006 |
| 1.456 | 0.006 |
| 1.457 | 0.006 |
| 1.458 | 0.006 |
| 1.459 | 0.006 |
| 1.46 | 0.006 |
| 1.461 | 0.006 |
| 1.462 | 0.006 |
| 1.463 | 0.006 |
| 1.464 | 0.005 |
| 1.465 | 0.005 |
| 1.466 | 0.005 |
| 1.467 | 0.005 |
| 1.468 | 0.005 |
| 1.469 | 0.005 |
| 1.47 | 0.005 |
| 1.471 | 0.005 |
| 1.472 | 0.005 |
| 1.473 | 0.005 |
| 1.474 | 0.005 |
| 1.475 | 0.005 |
| 1.476 | 0.005 |
| 1.477 | 0.005 |
| 1.478 | 0.005 |
| 1.479 | 0.005 |
| 1.48 | 0.005 |
| 1.481 | 0.005 |
| 1.482 | 0.005 |
| 1.483 | 0.005 |
| 1.484 | 0.005 |
| 1.485 | 0.005 |
| 1.486 | 0.005 |
| 1.487 | 0.005 |
| 1.488 | 0.005 |
| 1.489 | 0.005 |
| 1.49 | 0.005 |
| 1.491 | 0.005 |
| 1.492 | 0.005 |
| 1.493 | 0.005 |
| 1.494 | 0.005 |
| 1.495 | 0.005 |
| 1.496 | 0.005 |
| 1.497 | 0.005 |
| 1.498 | 0.005 |
| 1.499 | 0.005 |
| 1.5 | 0.005 |
| 1.501 | 0.005 |
| 1.502 | 0.005 |
| 1.503 | 0.005 |
| 1.504 | 0.005 |
| 1.505 | 0.005 |
| 1.506 | 0.005 |
| 1.507 | 0.005 |
| 1.508 | 0.005 |
| 1.509 | 0.005 |
| 1.51 | 0.005 |
| 1.511 | 0.005 |
| 1.512 | 0.005 |
| 1.513 | 0.005 |
| 1.514 | 0.005 |
| 1.515 | 0.005 |
| 1.516 | 0.005 |
| 1.517 | 0.005 |
| 1.518 | 0.005 |
| 1.519 | 0.005 |
| 1.52 | 0.005 |
| 1.521 | 0.005 |
| 1.522 | 0.005 |
| 1.523 | 0.005 |
| 1.524 | 0.005 |
| 1.525 | 0.005 |
| 1.526 | 0.005 |
| 1.527 | 0.005 |
| 1.528 | 0.005 |
| 1.529 | 0.005 |
| 1.53 | 0.005 |
| 1.531 | 0.005 |
| 1.532 | 0.005 |
| 1.533 | 0.005 |
| 1.534 | 0.005 |
| 1.535 | 0.005 |
| 1.536 | 0.005 |
| 1.537 | 0.005 |
| 1.538 | 0.005 |
| 1.539 | 0.005 |
| 1.54 | 0.005 |
| 1.541 | 0.005 |
| 1.542 | 0.005 |
| 1.543 | 0.005 |
| 1.544 | 0.005 |
| 1.545 | 0.005 |
| 1.546 | 0.005 |
| 1.547 | 0.005 |
| 1.548 | 0.005 |
| 1.549 | 0.005 |
| 1.55 | 0.005 |
| 1.551 | 0.005 |
| 1.552 | 0.005 |
| 1.553 | 0.005 |
| 1.554 | 0.005 |
| 1.555 | 0.005 |
| 1.556 | 0.005 |
| 1.557 | 0.005 |
| 1.558 | 0.005 |
| 1.559 | 0.004 |
| 1.56 | 0.004 |
| 1.561 | 0.004 |
| 1.562 | 0.004 |
| 1.563 | 0.004 |
| 1.564 | 0.004 |
| 1.565 | 0.004 |
| 1.566 | 0.004 |
| 1.567 | 0.004 |
| 1.568 | 0.004 |
| 1.569 | 0.004 |
| 1.57 | 0.004 |
| 1.571 | 0.004 |
| 1.572 | 0.004 |
| 1.573 | 0.004 |
| 1.574 | 0.004 |
| 1.575 | 0.004 |
| 1.576 | 0.004 |
| 1.577 | 0.004 |
| 1.578 | 0.004 |
| 1.579 | 0.004 |
| 1.58 | 0.004 |
| 1.581 | 0.004 |
| 1.582 | 0.004 |
| 1.583 | 0.004 |
| 1.584 | 0.004 |
| 1.585 | 0.004 |
| 1.586 | 0.004 |
| 1.587 | 0.004 |
| 1.588 | 0.004 |
| 1.589 | 0.004 |
| 1.59 | 0.004 |
| 1.591 | 0.004 |
| 1.592 | 0.004 |
| 1.593 | 0.004 |
| 1.594 | 0.004 |
| 1.595 | 0.004 |
| 1.596 | 0.004 |
| 1.597 | 0.004 |
| 1.598 | 0.004 |
| 1.599 | 0.004 |
| 1.6 | 0.004 |
| 1.601 | 0.004 |
| 1.602 | 0.004 |
| 1.603 | 0.004 |
| 1.604 | 0.004 |
| 1.605 | 0.004 |
| 1.606 | 0.004 |
| 1.607 | 0.004 |
| 1.608 | 0.004 |
| 1.609 | 0.004 |
| 1.61 | 0.004 |
| 1.611 | 0.004 |
| 1.612 | 0.004 |
| 1.613 | 0.004 |
| 1.614 | 0.004 |
| 1.615 | 0.004 |
| 1.616 | 0.004 |
| 1.617 | 0.004 |
| 1.618 | 0.004 |
| 1.619 | 0.004 |
| 1.62 | 0.004 |
| 1.621 | 0.004 |
| 1.622 | 0.004 |
| 1.623 | 0.004 |
| 1.624 | 0.004 |
| 1.625 | 0.004 |
| 1.626 | 0.004 |
| 1.627 | 0.004 |
| 1.628 | 0.004 |
| 1.629 | 0.004 |
| 1.63 | 0.004 |
| 1.631 | 0.004 |
| 1.632 | 0.004 |
| 1.633 | 0.004 |
| 1.634 | 0.004 |
| 1.635 | 0.004 |
| 1.636 | 0.004 |
| 1.637 | 0.004 |
| 1.638 | 0.004 |
| 1.639 | 0.004 |
| 1.64 | 0.004 |
| 1.641 | 0.004 |
| 1.642 | 0.004 |
| 1.643 | 0.004 |
| 1.644 | 0.004 |
| 1.645 | 0.004 |
| 1.646 | 0.004 |
| 1.647 | 0.004 |
| 1.648 | 0.004 |
| 1.649 | 0.004 |
| 1.65 | 0.004 |
| 1.651 | 0.004 |
| 1.652 | 0.004 |
| 1.653 | 0.004 |
| 1.654 | 0.004 |
| 1.655 | 0.004 |
| 1.656 | 0.004 |
| 1.657 | 0.004 |
| 1.658 | 0.004 |
| 1.659 | 0.004 |
| 1.66 | 0.004 |
| 1.661 | 0.004 |
| 1.662 | 0.004 |
| 1.663 | 0.004 |
| 1.664 | 0.004 |
| 1.665 | 0.004 |
| 1.666 | 0.004 |
| 1.667 | 0.004 |
| 1.668 | 0.004 |
| 1.669 | 0.004 |
| 1.67 | 0.004 |
| 1.671 | 0.004 |
| 1.672 | 0.004 |
| 1.673 | 0.004 |
| 1.674 | 0.004 |
| 1.675 | 0.004 |
| 1.676 | 0.004 |
| 1.677 | 0.004 |
| 1.678 | 0.004 |
| 1.679 | 0.004 |
| 1.68 | 0.004 |
| 1.681 | 0.004 |
| 1.682 | 0.004 |
| 1.683 | 0.004 |
| 1.684 | 0.004 |
| 1.685 | 0.004 |
| 1.686 | 0.004 |
| 1.687 | 0.004 |
| 1.688 | 0.004 |
| 1.689 | 0.004 |
| 1.69 | 0.004 |
| 1.691 | 0.004 |
| 1.692 | 0.003 |
| 1.693 | 0.003 |
| 1.694 | 0.003 |
| 1.695 | 0.003 |
| 1.696 | 0.003 |
| 1.697 | 0.003 |
| 1.698 | 0.003 |
| 1.699 | 0.003 |
| 1.7 | 0.003 |
| 1.701 | 0.003 |
| 1.702 | 0.003 |
| 1.703 | 0.003 |
| 1.704 | 0.003 |
| 1.705 | 0.003 |
| 1.706 | 0.003 |
| 1.707 | 0.003 |
| 1.708 | 0.003 |
| 1.709 | 0.003 |
| 1.71 | 0.003 |
| 1.711 | 0.003 |
| 1.712 | 0.003 |
| 1.713 | 0.003 |
| 1.714 | 0.003 |
| 1.715 | 0.003 |
| 1.716 | 0.003 |
| 1.717 | 0.003 |
| 1.718 | 0.003 |
| 1.719 | 0.002 |
| 1.72 | 0 |